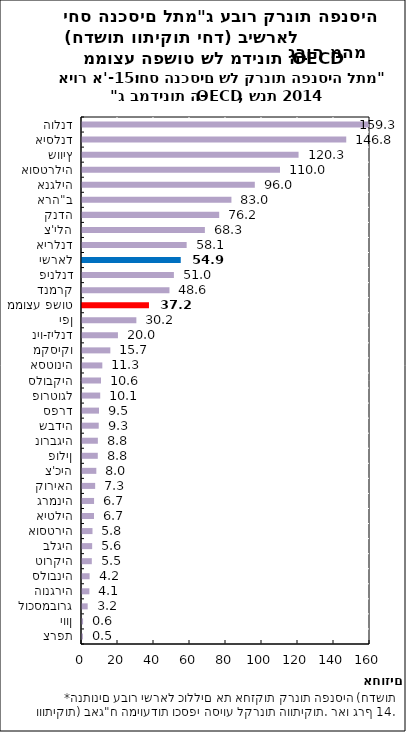
| Category | יחס |
|---|---|
| הולנד | 159.321 |
| איסלנד | 146.804 |
| שוויץ | 120.315 |
| אוסטרליה | 109.999 |
| אנגליה | 96.011 |
| ארה"ב | 83.015 |
| קנדה | 76.221 |
| צ'ילה | 68.268 |
| אירלנד | 58.141 |
| ישראל | 54.859 |
| פינלנד | 51.049 |
| דנמרק | 48.593 |
| ממוצע פשוט | 37.204 |
| יפן | 30.198 |
| ניו-זילנד | 19.963 |
| מקסיקו | 15.738 |
| אסטוניה | 11.29 |
| סלובקיה | 10.562 |
| פורטוגל | 10.117 |
| ספרד | 9.461 |
| שבדיה | 9.296 |
| נורבגיה | 8.813 |
| פולין | 8.77 |
| צ'כיה | 7.96 |
| קוריאה | 7.312 |
| גרמניה | 6.7 |
| איטליה | 6.658 |
| אוסטריה | 5.829 |
| בלגיה | 5.647 |
| טורקיה | 5.454 |
| סלובניה | 4.227 |
| הונגריה | 4.101 |
| לוכסמבורג | 3.159 |
| יוון | 0.608 |
| צרפת | 0.483 |